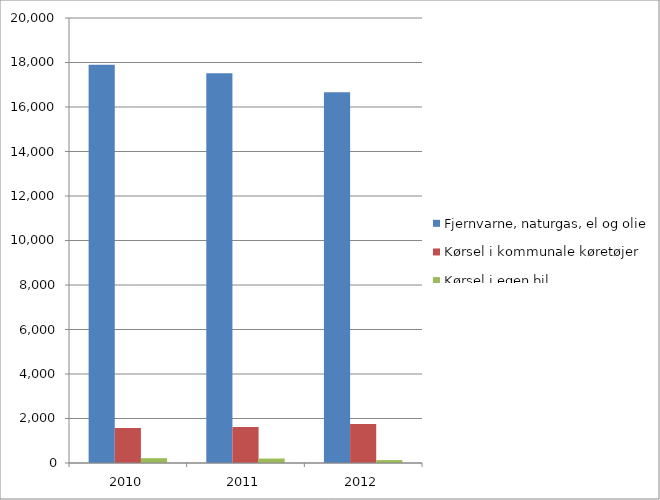
| Category | Fjernvarne, naturgas, el og olie  | Kørsel i kommunale køretøjer  | Kørsel i egen bil  |
|---|---|---|---|
| 2010.0 | 17898 | 1572 | 216 |
| 2011.0 | 17513 | 1620 | 201 |
| 2012.0 | 16667 | 1751 | 130 |